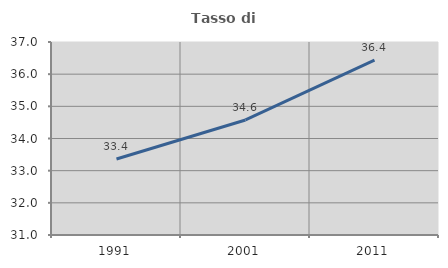
| Category | Tasso di occupazione   |
|---|---|
| 1991.0 | 33.365 |
| 2001.0 | 34.576 |
| 2011.0 | 36.436 |